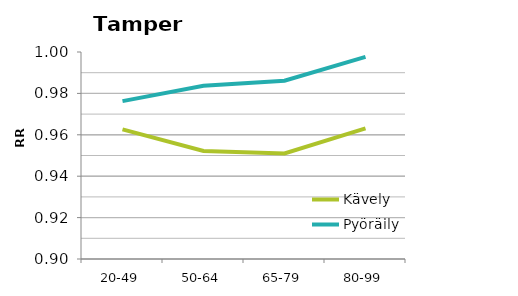
| Category | Kävely | Pyöräily |
|---|---|---|
| 20-49 | 0.963 | 0.976 |
| 50-64 | 0.952 | 0.984 |
| 65-79 | 0.951 | 0.986 |
| 80-99 | 0.963 | 0.998 |